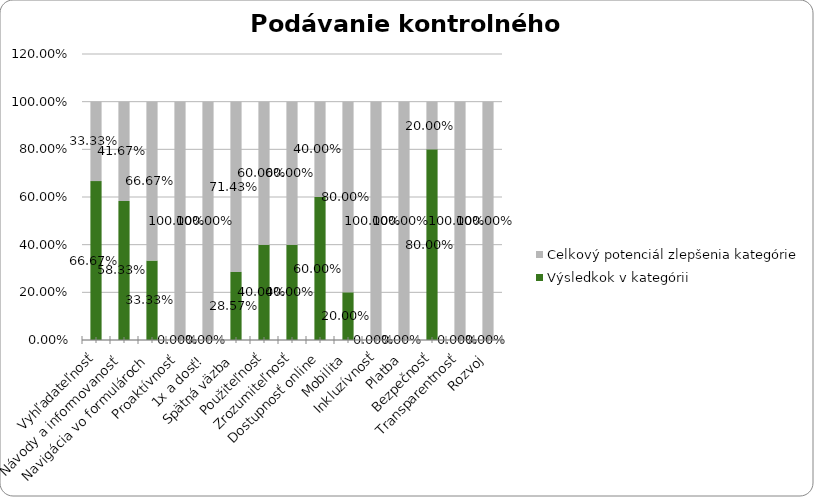
| Category | Výsledkok v kategórii | Celkový potenciál zlepšenia kategórie |
|---|---|---|
| Vyhľadateľnosť | 0.667 | 0.333 |
| Návody a informovanosť | 0.583 | 0.417 |
| Navigácia vo formulároch | 0.333 | 0.667 |
| Proaktívnosť | 0 | 1 |
| 1x a dosť! | 0 | 1 |
| Spätná väzba | 0.286 | 0.714 |
| Použiteľnosť | 0.4 | 0.6 |
| Zrozumiteľnosť | 0.4 | 0.6 |
| Dostupnosť online | 0.6 | 0.4 |
| Mobilita | 0.2 | 0.8 |
| Inkluzívnosť | 0 | 1 |
| Platba | 0 | 1 |
| Bezpečnosť | 0.8 | 0.2 |
| Transparentnosť | 0 | 1 |
| Rozvoj | 0 | 1 |